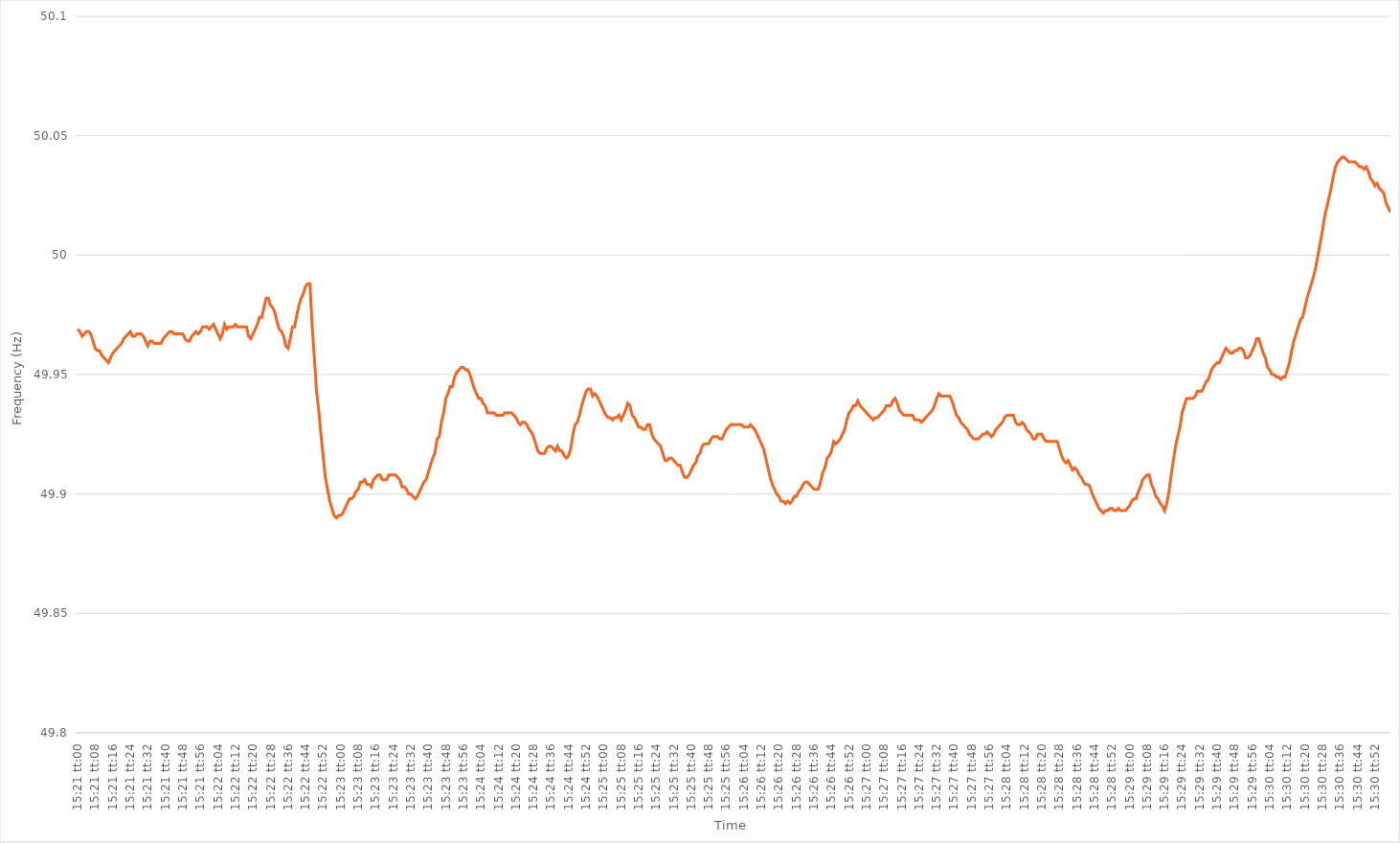
| Category | Series 0 |
|---|---|
| 0.6395833333333333 | 49.969 |
| 0.6395949074074074 | 49.968 |
| 0.6396064814814815 | 49.966 |
| 0.6396180555555556 | 49.967 |
| 0.6396296296296297 | 49.968 |
| 0.6396412037037037 | 49.968 |
| 0.6396527777777777 | 49.967 |
| 0.6396643518518519 | 49.964 |
| 0.6396759259259259 | 49.961 |
| 0.6396875 | 49.96 |
| 0.6396990740740741 | 49.96 |
| 0.6397106481481482 | 49.958 |
| 0.6397222222222222 | 49.957 |
| 0.6397337962962962 | 49.956 |
| 0.6397453703703704 | 49.955 |
| 0.6397569444444444 | 49.957 |
| 0.6397685185185186 | 49.959 |
| 0.6397800925925926 | 49.96 |
| 0.6397916666666666 | 49.961 |
| 0.6398032407407407 | 49.962 |
| 0.6398148148148148 | 49.963 |
| 0.6398263888888889 | 49.965 |
| 0.639837962962963 | 49.966 |
| 0.6398495370370371 | 49.967 |
| 0.6398611111111111 | 49.968 |
| 0.6398726851851851 | 49.966 |
| 0.6398842592592593 | 49.966 |
| 0.6398958333333333 | 49.967 |
| 0.6399074074074074 | 49.967 |
| 0.6399189814814815 | 49.967 |
| 0.6399305555555556 | 49.966 |
| 0.6399421296296296 | 49.964 |
| 0.6399537037037036 | 49.962 |
| 0.6399652777777778 | 49.964 |
| 0.6399768518518518 | 49.964 |
| 0.639988425925926 | 49.963 |
| 0.64 | 49.963 |
| 0.640011574074074 | 49.963 |
| 0.6400231481481481 | 49.963 |
| 0.6400347222222222 | 49.965 |
| 0.6400462962962963 | 49.966 |
| 0.6400578703703704 | 49.967 |
| 0.6400694444444445 | 49.968 |
| 0.6400810185185185 | 49.968 |
| 0.6400925925925925 | 49.967 |
| 0.6401041666666667 | 49.967 |
| 0.6401157407407407 | 49.967 |
| 0.6401273148148149 | 49.967 |
| 0.6401388888888889 | 49.967 |
| 0.640150462962963 | 49.965 |
| 0.640162037037037 | 49.964 |
| 0.640173611111111 | 49.964 |
| 0.6401851851851852 | 49.966 |
| 0.6401967592592592 | 49.967 |
| 0.6402083333333334 | 49.968 |
| 0.6402199074074074 | 49.967 |
| 0.6402314814814815 | 49.968 |
| 0.6402430555555555 | 49.97 |
| 0.6402546296296296 | 49.97 |
| 0.6402662037037037 | 49.97 |
| 0.6402777777777778 | 49.969 |
| 0.6402893518518519 | 49.97 |
| 0.6403009259259259 | 49.971 |
| 0.6403125 | 49.969 |
| 0.6403240740740741 | 49.967 |
| 0.6403356481481481 | 49.965 |
| 0.6403472222222223 | 49.967 |
| 0.6403587962962963 | 49.971 |
| 0.6403703703703704 | 49.969 |
| 0.6403819444444444 | 49.97 |
| 0.6403935185185184 | 49.97 |
| 0.6404050925925926 | 49.97 |
| 0.6404166666666666 | 49.971 |
| 0.6404282407407408 | 49.97 |
| 0.6404398148148148 | 49.97 |
| 0.6404513888888889 | 49.97 |
| 0.6404629629629629 | 49.97 |
| 0.640474537037037 | 49.97 |
| 0.6404861111111111 | 49.966 |
| 0.6404976851851852 | 49.965 |
| 0.6405092592592593 | 49.967 |
| 0.6405208333333333 | 49.969 |
| 0.6405324074074074 | 49.971 |
| 0.6405439814814815 | 49.974 |
| 0.6405555555555555 | 49.974 |
| 0.6405671296296297 | 49.978 |
| 0.6405787037037037 | 49.982 |
| 0.6405902777777778 | 49.982 |
| 0.6406018518518518 | 49.979 |
| 0.640613425925926 | 49.978 |
| 0.640625 | 49.976 |
| 0.640636574074074 | 49.972 |
| 0.6406481481481482 | 49.969 |
| 0.6406597222222222 | 49.968 |
| 0.6406712962962963 | 49.966 |
| 0.6406828703703703 | 49.962 |
| 0.6406944444444445 | 49.961 |
| 0.6407060185185185 | 49.965 |
| 0.6407175925925926 | 49.97 |
| 0.6407291666666667 | 49.97 |
| 0.6407407407407407 | 49.975 |
| 0.6407523148148148 | 49.979 |
| 0.6407638888888889 | 49.982 |
| 0.640775462962963 | 49.984 |
| 0.6407870370370371 | 49.987 |
| 0.6407986111111111 | 49.988 |
| 0.6408101851851852 | 49.988 |
| 0.6408217592592592 | 49.97 |
| 0.6408333333333334 | 49.957 |
| 0.6408449074074074 | 49.943 |
| 0.6408564814814816 | 49.935 |
| 0.6408680555555556 | 49.925 |
| 0.6408796296296296 | 49.916 |
| 0.6408912037037037 | 49.907 |
| 0.6409027777777777 | 49.902 |
| 0.6409143518518519 | 49.897 |
| 0.6409259259259259 | 49.894 |
| 0.6409375 | 49.891 |
| 0.6409490740740741 | 49.89 |
| 0.6409606481481481 | 49.891 |
| 0.6409722222222222 | 49.891 |
| 0.6409837962962963 | 49.892 |
| 0.6409953703703704 | 49.894 |
| 0.6410069444444445 | 49.896 |
| 0.6410185185185185 | 49.898 |
| 0.6410300925925926 | 49.898 |
| 0.6410416666666666 | 49.899 |
| 0.6410532407407408 | 49.901 |
| 0.6410648148148148 | 49.902 |
| 0.641076388888889 | 49.905 |
| 0.641087962962963 | 49.905 |
| 0.641099537037037 | 49.906 |
| 0.6411111111111111 | 49.904 |
| 0.6411226851851851 | 49.904 |
| 0.6411342592592593 | 49.903 |
| 0.6411458333333333 | 49.906 |
| 0.6411574074074075 | 49.907 |
| 0.6411689814814815 | 49.908 |
| 0.6411805555555555 | 49.908 |
| 0.6411921296296296 | 49.906 |
| 0.6412037037037037 | 49.906 |
| 0.6412152777777778 | 49.906 |
| 0.6412268518518519 | 49.908 |
| 0.641238425925926 | 49.908 |
| 0.64125 | 49.908 |
| 0.641261574074074 | 49.908 |
| 0.6412731481481482 | 49.907 |
| 0.6412847222222222 | 49.906 |
| 0.6412962962962964 | 49.903 |
| 0.6413078703703704 | 49.903 |
| 0.6413194444444444 | 49.902 |
| 0.6413310185185185 | 49.9 |
| 0.6413425925925926 | 49.9 |
| 0.6413541666666667 | 49.899 |
| 0.6413657407407407 | 49.898 |
| 0.6413773148148149 | 49.899 |
| 0.6413888888888889 | 49.901 |
| 0.6414004629629629 | 49.903 |
| 0.641412037037037 | 49.905 |
| 0.6414236111111111 | 49.906 |
| 0.6414351851851852 | 49.909 |
| 0.6414467592592593 | 49.912 |
| 0.6414583333333334 | 49.915 |
| 0.6414699074074074 | 49.917 |
| 0.6414814814814814 | 49.923 |
| 0.6414930555555556 | 49.924 |
| 0.6415046296296296 | 49.93 |
| 0.6415162037037038 | 49.934 |
| 0.6415277777777778 | 49.94 |
| 0.6415393518518518 | 49.942 |
| 0.6415509259259259 | 49.945 |
| 0.6415625 | 49.945 |
| 0.6415740740740741 | 49.949 |
| 0.6415856481481481 | 49.951 |
| 0.6415972222222223 | 49.952 |
| 0.6416087962962963 | 49.953 |
| 0.6416203703703703 | 49.953 |
| 0.6416319444444444 | 49.952 |
| 0.6416435185185185 | 49.952 |
| 0.6416550925925926 | 49.95 |
| 0.6416666666666667 | 49.947 |
| 0.6416782407407408 | 49.944 |
| 0.6416898148148148 | 49.942 |
| 0.6417013888888888 | 49.94 |
| 0.641712962962963 | 49.94 |
| 0.641724537037037 | 49.938 |
| 0.6417361111111112 | 49.937 |
| 0.6417476851851852 | 49.934 |
| 0.6417592592592593 | 49.934 |
| 0.6417708333333333 | 49.934 |
| 0.6417824074074074 | 49.934 |
| 0.6417939814814815 | 49.933 |
| 0.6418055555555555 | 49.933 |
| 0.6418171296296297 | 49.933 |
| 0.6418287037037037 | 49.933 |
| 0.6418402777777777 | 49.934 |
| 0.6418518518518518 | 49.934 |
| 0.6418634259259259 | 49.934 |
| 0.641875 | 49.934 |
| 0.6418865740740741 | 49.933 |
| 0.6418981481481482 | 49.932 |
| 0.6419097222222222 | 49.93 |
| 0.6419212962962962 | 49.929 |
| 0.6419328703703704 | 49.93 |
| 0.6419444444444444 | 49.93 |
| 0.6419560185185186 | 49.929 |
| 0.6419675925925926 | 49.927 |
| 0.6419791666666667 | 49.926 |
| 0.6419907407407407 | 49.924 |
| 0.6420023148148148 | 49.921 |
| 0.6420138888888889 | 49.918 |
| 0.642025462962963 | 49.917 |
| 0.6420370370370371 | 49.917 |
| 0.6420486111111111 | 49.917 |
| 0.6420601851851852 | 49.919 |
| 0.6420717592592592 | 49.92 |
| 0.6420833333333333 | 49.92 |
| 0.6420949074074074 | 49.919 |
| 0.6421064814814815 | 49.918 |
| 0.6421180555555556 | 49.92 |
| 0.6421296296296296 | 49.918 |
| 0.6421412037037036 | 49.918 |
| 0.6421527777777778 | 49.916 |
| 0.6421643518518518 | 49.915 |
| 0.642175925925926 | 49.916 |
| 0.6421875 | 49.919 |
| 0.6421990740740741 | 49.925 |
| 0.6422106481481481 | 49.929 |
| 0.6422222222222222 | 49.93 |
| 0.6422337962962963 | 49.933 |
| 0.6422453703703704 | 49.937 |
| 0.6422569444444445 | 49.94 |
| 0.6422685185185185 | 49.943 |
| 0.6422800925925926 | 49.944 |
| 0.6422916666666666 | 49.944 |
| 0.6423032407407407 | 49.941 |
| 0.6423148148148148 | 49.942 |
| 0.6423263888888889 | 49.941 |
| 0.642337962962963 | 49.939 |
| 0.642349537037037 | 49.937 |
| 0.642361111111111 | 49.935 |
| 0.6423726851851852 | 49.933 |
| 0.6423842592592592 | 49.932 |
| 0.6423958333333334 | 49.932 |
| 0.6424074074074074 | 49.931 |
| 0.6424189814814815 | 49.932 |
| 0.6424305555555555 | 49.932 |
| 0.6424421296296297 | 49.933 |
| 0.6424537037037037 | 49.931 |
| 0.6424652777777778 | 49.933 |
| 0.6424768518518519 | 49.935 |
| 0.6424884259259259 | 49.938 |
| 0.6425 | 49.937 |
| 0.642511574074074 | 49.933 |
| 0.6425231481481481 | 49.932 |
| 0.6425347222222222 | 49.93 |
| 0.6425462962962963 | 49.928 |
| 0.6425578703703704 | 49.928 |
| 0.6425694444444444 | 49.927 |
| 0.6425810185185185 | 49.927 |
| 0.6425925925925926 | 49.929 |
| 0.6426041666666666 | 49.929 |
| 0.6426157407407408 | 49.925 |
| 0.6426273148148148 | 49.923 |
| 0.6426388888888889 | 49.922 |
| 0.6426504629629629 | 49.921 |
| 0.6426620370370371 | 49.92 |
| 0.6426736111111111 | 49.917 |
| 0.6426851851851852 | 49.914 |
| 0.6426967592592593 | 49.914 |
| 0.6427083333333333 | 49.915 |
| 0.6427199074074074 | 49.915 |
| 0.6427314814814815 | 49.914 |
| 0.6427430555555556 | 49.913 |
| 0.6427546296296297 | 49.912 |
| 0.6427662037037037 | 49.912 |
| 0.6427777777777778 | 49.909 |
| 0.6427893518518518 | 49.907 |
| 0.6428009259259259 | 49.907 |
| 0.6428125 | 49.908 |
| 0.642824074074074 | 49.91 |
| 0.6428356481481482 | 49.912 |
| 0.6428472222222222 | 49.913 |
| 0.6428587962962963 | 49.916 |
| 0.6428703703703703 | 49.917 |
| 0.6428819444444445 | 49.92 |
| 0.6428935185185185 | 49.921 |
| 0.6429050925925927 | 49.921 |
| 0.6429166666666667 | 49.921 |
| 0.6429282407407407 | 49.923 |
| 0.6429398148148148 | 49.924 |
| 0.6429513888888889 | 49.924 |
| 0.642962962962963 | 49.924 |
| 0.6429745370370371 | 49.923 |
| 0.6429861111111111 | 49.923 |
| 0.6429976851851852 | 49.925 |
| 0.6430092592592592 | 49.927 |
| 0.6430208333333333 | 49.928 |
| 0.6430324074074074 | 49.929 |
| 0.6430439814814815 | 49.929 |
| 0.6430555555555556 | 49.929 |
| 0.6430671296296296 | 49.929 |
| 0.6430787037037037 | 49.929 |
| 0.6430902777777777 | 49.929 |
| 0.6431018518518519 | 49.928 |
| 0.6431134259259259 | 49.928 |
| 0.6431250000000001 | 49.928 |
| 0.6431365740740741 | 49.929 |
| 0.6431481481481481 | 49.928 |
| 0.6431597222222222 | 49.927 |
| 0.6431712962962963 | 49.925 |
| 0.6431828703703704 | 49.923 |
| 0.6431944444444445 | 49.921 |
| 0.6432060185185186 | 49.919 |
| 0.6432175925925926 | 49.915 |
| 0.6432291666666666 | 49.911 |
| 0.6432407407407407 | 49.907 |
| 0.6432523148148148 | 49.904 |
| 0.6432638888888889 | 49.902 |
| 0.643275462962963 | 49.9 |
| 0.643287037037037 | 49.899 |
| 0.6432986111111111 | 49.897 |
| 0.6433101851851851 | 49.897 |
| 0.6433217592592593 | 49.896 |
| 0.6433333333333333 | 49.897 |
| 0.6433449074074075 | 49.896 |
| 0.6433564814814815 | 49.897 |
| 0.6433680555555555 | 49.899 |
| 0.6433796296296296 | 49.899 |
| 0.6433912037037037 | 49.901 |
| 0.6434027777777778 | 49.902 |
| 0.6434143518518519 | 49.904 |
| 0.643425925925926 | 49.905 |
| 0.6434375 | 49.905 |
| 0.643449074074074 | 49.904 |
| 0.6434606481481482 | 49.903 |
| 0.6434722222222222 | 49.902 |
| 0.6434837962962963 | 49.902 |
| 0.6434953703703704 | 49.902 |
| 0.6435069444444445 | 49.905 |
| 0.6435185185185185 | 49.909 |
| 0.6435300925925925 | 49.911 |
| 0.6435416666666667 | 49.915 |
| 0.6435532407407407 | 49.916 |
| 0.6435648148148149 | 49.918 |
| 0.6435763888888889 | 49.922 |
| 0.643587962962963 | 49.921 |
| 0.643599537037037 | 49.922 |
| 0.6436111111111111 | 49.923 |
| 0.6436226851851852 | 49.925 |
| 0.6436342592592593 | 49.927 |
| 0.6436458333333334 | 49.931 |
| 0.6436574074074074 | 49.934 |
| 0.6436689814814814 | 49.935 |
| 0.6436805555555556 | 49.937 |
| 0.6436921296296296 | 49.937 |
| 0.6437037037037037 | 49.939 |
| 0.6437152777777778 | 49.937 |
| 0.6437268518518519 | 49.936 |
| 0.6437384259259259 | 49.935 |
| 0.6437499999999999 | 49.934 |
| 0.6437615740740741 | 49.933 |
| 0.6437731481481481 | 49.932 |
| 0.6437847222222223 | 49.931 |
| 0.6437962962962963 | 49.932 |
| 0.6438078703703703 | 49.932 |
| 0.6438194444444444 | 49.933 |
| 0.6438310185185185 | 49.934 |
| 0.6438425925925926 | 49.935 |
| 0.6438541666666667 | 49.937 |
| 0.6438657407407408 | 49.937 |
| 0.6438773148148148 | 49.937 |
| 0.6438888888888888 | 49.939 |
| 0.643900462962963 | 49.94 |
| 0.643912037037037 | 49.938 |
| 0.6439236111111112 | 49.935 |
| 0.6439351851851852 | 49.934 |
| 0.6439467592592593 | 49.933 |
| 0.6439583333333333 | 49.933 |
| 0.6439699074074073 | 49.933 |
| 0.6439814814814815 | 49.933 |
| 0.6439930555555555 | 49.933 |
| 0.6440046296296297 | 49.931 |
| 0.6440162037037037 | 49.931 |
| 0.6440277777777778 | 49.931 |
| 0.6440393518518518 | 49.93 |
| 0.6440509259259259 | 49.931 |
| 0.6440625 | 49.932 |
| 0.6440740740740741 | 49.933 |
| 0.6440856481481482 | 49.934 |
| 0.6440972222222222 | 49.935 |
| 0.6441087962962962 | 49.937 |
| 0.6441203703703704 | 49.94 |
| 0.6441319444444444 | 49.942 |
| 0.6441435185185186 | 49.941 |
| 0.6441550925925926 | 49.941 |
| 0.6441666666666667 | 49.941 |
| 0.6441782407407407 | 49.941 |
| 0.6441898148148147 | 49.941 |
| 0.6442013888888889 | 49.939 |
| 0.6442129629629629 | 49.936 |
| 0.6442245370370371 | 49.933 |
| 0.6442361111111111 | 49.932 |
| 0.6442476851851852 | 49.93 |
| 0.6442592592592592 | 49.929 |
| 0.6442708333333333 | 49.928 |
| 0.6442824074074074 | 49.927 |
| 0.6442939814814815 | 49.925 |
| 0.6443055555555556 | 49.924 |
| 0.6443171296296296 | 49.923 |
| 0.6443287037037037 | 49.923 |
| 0.6443402777777778 | 49.923 |
| 0.6443518518518518 | 49.924 |
| 0.644363425925926 | 49.925 |
| 0.644375 | 49.925 |
| 0.6443865740740741 | 49.926 |
| 0.6443981481481481 | 49.925 |
| 0.6444097222222221 | 49.924 |
| 0.6444212962962963 | 49.925 |
| 0.6444328703703703 | 49.927 |
| 0.6444444444444445 | 49.928 |
| 0.6444560185185185 | 49.929 |
| 0.6444675925925926 | 49.93 |
| 0.6444791666666666 | 49.932 |
| 0.6444907407407408 | 49.933 |
| 0.6445023148148148 | 49.933 |
| 0.6445138888888889 | 49.933 |
| 0.644525462962963 | 49.933 |
| 0.644537037037037 | 49.93 |
| 0.6445486111111111 | 49.929 |
| 0.6445601851851852 | 49.929 |
| 0.6445717592592592 | 49.93 |
| 0.6445833333333334 | 49.929 |
| 0.6445949074074074 | 49.927 |
| 0.6446064814814815 | 49.926 |
| 0.6446180555555555 | 49.925 |
| 0.6446296296296297 | 49.923 |
| 0.6446412037037037 | 49.923 |
| 0.6446527777777779 | 49.925 |
| 0.6446643518518519 | 49.925 |
| 0.6446759259259259 | 49.925 |
| 0.6446875 | 49.923 |
| 0.644699074074074 | 49.922 |
| 0.6447106481481482 | 49.922 |
| 0.6447222222222222 | 49.922 |
| 0.6447337962962963 | 49.922 |
| 0.6447453703703704 | 49.922 |
| 0.6447569444444444 | 49.922 |
| 0.6447685185185185 | 49.919 |
| 0.6447800925925926 | 49.916 |
| 0.6447916666666667 | 49.914 |
| 0.6448032407407408 | 49.913 |
| 0.6448148148148148 | 49.914 |
| 0.6448263888888889 | 49.912 |
| 0.6448379629629629 | 49.91 |
| 0.6448495370370371 | 49.911 |
| 0.6448611111111111 | 49.91 |
| 0.6448726851851853 | 49.908 |
| 0.6448842592592593 | 49.907 |
| 0.6448958333333333 | 49.905 |
| 0.6449074074074074 | 49.904 |
| 0.6449189814814814 | 49.904 |
| 0.6449305555555556 | 49.903 |
| 0.6449421296296296 | 49.9 |
| 0.6449537037037038 | 49.898 |
| 0.6449652777777778 | 49.896 |
| 0.6449768518518518 | 49.894 |
| 0.6449884259259259 | 49.893 |
| 0.645 | 49.892 |
| 0.6450115740740741 | 49.893 |
| 0.6450231481481482 | 49.893 |
| 0.6450347222222222 | 49.894 |
| 0.6450462962962963 | 49.894 |
| 0.6450578703703703 | 49.893 |
| 0.6450694444444445 | 49.893 |
| 0.6450810185185185 | 49.894 |
| 0.6450925925925927 | 49.893 |
| 0.6451041666666667 | 49.893 |
| 0.6451157407407407 | 49.893 |
| 0.6451273148148148 | 49.894 |
| 0.6451388888888888 | 49.895 |
| 0.645150462962963 | 49.897 |
| 0.645162037037037 | 49.898 |
| 0.6451736111111112 | 49.898 |
| 0.6451851851851852 | 49.901 |
| 0.6451967592592592 | 49.903 |
| 0.6452083333333333 | 49.906 |
| 0.6452199074074074 | 49.907 |
| 0.6452314814814815 | 49.908 |
| 0.6452430555555556 | 49.908 |
| 0.6452546296296297 | 49.904 |
| 0.6452662037037037 | 49.902 |
| 0.6452777777777777 | 49.899 |
| 0.6452893518518519 | 49.898 |
| 0.6453009259259259 | 49.896 |
| 0.6453125000000001 | 49.895 |
| 0.6453240740740741 | 49.893 |
| 0.6453356481481481 | 49.896 |
| 0.6453472222222222 | 49.901 |
| 0.6453587962962963 | 49.908 |
| 0.6453703703703704 | 49.914 |
| 0.6453819444444444 | 49.92 |
| 0.6453935185185186 | 49.924 |
| 0.6454050925925926 | 49.928 |
| 0.6454166666666666 | 49.934 |
| 0.6454282407407407 | 49.937 |
| 0.6454398148148148 | 49.94 |
| 0.6454513888888889 | 49.94 |
| 0.645462962962963 | 49.94 |
| 0.645474537037037 | 49.94 |
| 0.6454861111111111 | 49.941 |
| 0.6454976851851851 | 49.943 |
| 0.6455092592592593 | 49.943 |
| 0.6455208333333333 | 49.943 |
| 0.6455324074074075 | 49.945 |
| 0.6455439814814815 | 49.947 |
| 0.6455555555555555 | 49.948 |
| 0.6455671296296296 | 49.951 |
| 0.6455787037037037 | 49.953 |
| 0.6455902777777778 | 49.954 |
| 0.6456018518518518 | 49.955 |
| 0.645613425925926 | 49.955 |
| 0.645625 | 49.957 |
| 0.645636574074074 | 49.959 |
| 0.6456481481481481 | 49.961 |
| 0.6456597222222222 | 49.96 |
| 0.6456712962962963 | 49.959 |
| 0.6456828703703704 | 49.959 |
| 0.6456944444444445 | 49.96 |
| 0.6457060185185185 | 49.96 |
| 0.6457175925925925 | 49.961 |
| 0.6457291666666667 | 49.961 |
| 0.6457407407407407 | 49.96 |
| 0.6457523148148149 | 49.957 |
| 0.6457638888888889 | 49.957 |
| 0.645775462962963 | 49.958 |
| 0.645787037037037 | 49.96 |
| 0.6457986111111111 | 49.962 |
| 0.6458101851851852 | 49.965 |
| 0.6458217592592593 | 49.965 |
| 0.6458333333333334 | 49.962 |
| 0.6458449074074074 | 49.959 |
| 0.6458564814814814 | 49.957 |
| 0.6458680555555555 | 49.953 |
| 0.6458796296296296 | 49.952 |
| 0.6458912037037037 | 49.95 |
| 0.6459027777777778 | 49.95 |
| 0.6459143518518519 | 49.949 |
| 0.6459259259259259 | 49.949 |
| 0.6459374999999999 | 49.948 |
| 0.6459490740740741 | 49.949 |
| 0.6459606481481481 | 49.949 |
| 0.6459722222222223 | 49.952 |
| 0.6459837962962963 | 49.955 |
| 0.6459953703703704 | 49.96 |
| 0.6460069444444444 | 49.964 |
| 0.6460185185185185 | 49.967 |
| 0.6460300925925926 | 49.97 |
| 0.6460416666666667 | 49.973 |
| 0.6460532407407408 | 49.974 |
| 0.6460648148148148 | 49.978 |
| 0.6460763888888889 | 49.982 |
| 0.6460879629629629 | 49.985 |
| 0.646099537037037 | 49.988 |
| 0.6461111111111111 | 49.991 |
| 0.6461226851851852 | 49.995 |
| 0.6461342592592593 | 50 |
| 0.6461458333333333 | 50.005 |
| 0.6461574074074073 | 50.01 |
| 0.6461689814814815 | 50.016 |
| 0.6461805555555555 | 50.02 |
| 0.6461921296296297 | 50.024 |
| 0.6462037037037037 | 50.028 |
| 0.6462152777777778 | 50.033 |
| 0.6462268518518518 | 50.037 |
| 0.646238425925926 | 50.039 |
| 0.64625 | 50.04 |
| 0.6462615740740741 | 50.041 |
| 0.6462731481481482 | 50.041 |
| 0.6462847222222222 | 50.04 |
| 0.6462962962962963 | 50.039 |
| 0.6463078703703703 | 50.039 |
| 0.6463194444444444 | 50.039 |
| 0.6463310185185185 | 50.039 |
| 0.6463425925925926 | 50.038 |
| 0.6463541666666667 | 50.037 |
| 0.6463657407407407 | 50.037 |
| 0.6463773148148148 | 50.036 |
| 0.6463888888888889 | 50.037 |
| 0.6464004629629629 | 50.035 |
| 0.6464120370370371 | 50.032 |
| 0.6464236111111111 | 50.031 |
| 0.6464351851851852 | 50.029 |
| 0.6464467592592592 | 50.03 |
| 0.6464583333333334 | 50.028 |
| 0.6464699074074074 | 50.027 |
| 0.6464814814814815 | 50.026 |
| 0.6464930555555556 | 50.022 |
| 0.6465046296296296 | 50.02 |
| 0.6465162037037037 | 50.018 |